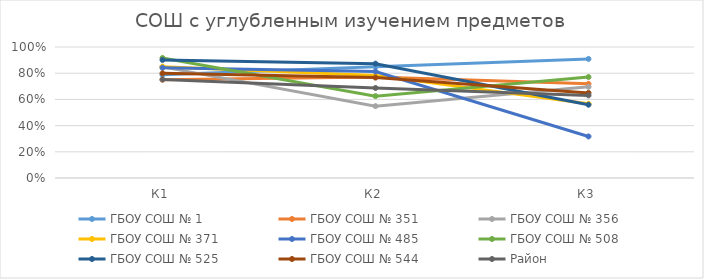
| Category | ГБОУ СОШ № 1 | ГБОУ СОШ № 351 | ГБОУ СОШ № 356 | ГБОУ СОШ № 371 | ГБОУ СОШ № 485 | ГБОУ СОШ № 508 | ГБОУ СОШ № 525 | ГБОУ СОШ № 544 | Район |
|---|---|---|---|---|---|---|---|---|---|
| К1 | 0.788 | 0.75 | 0.848 | 0.85 | 0.841 | 0.917 | 0.901 | 0.799 | 0.752 |
| К2 | 0.848 | 0.771 | 0.549 | 0.783 | 0.813 | 0.625 | 0.873 | 0.766 | 0.687 |
| К3 | 0.909 | 0.719 | 0.696 | 0.567 | 0.317 | 0.771 | 0.559 | 0.649 | 0.631 |